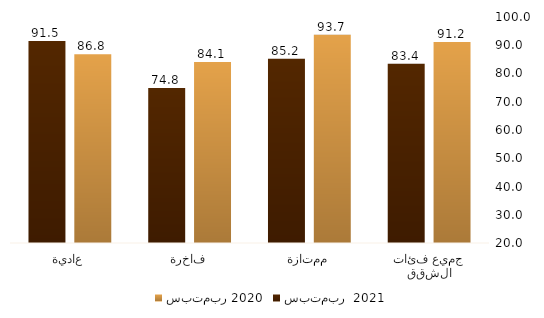
| Category | سبتمبر 2020 | سبتمبر  2021 |
|---|---|---|
| جميع فئات الشقق | 91.157 | 83.435 |
| ممتازة | 93.734 | 85.236 |
| فاخرة | 84.079 | 74.834 |
| عادية | 86.774 | 91.524 |